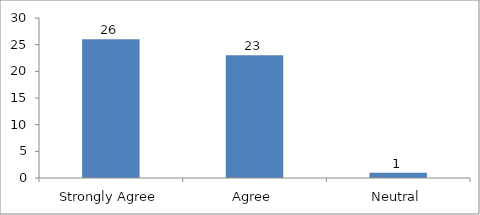
| Category | The speaker was knowledgeable about the topic? |
|---|---|
| Strongly Agree | 26 |
| Agree | 23 |
| Neutral | 1 |